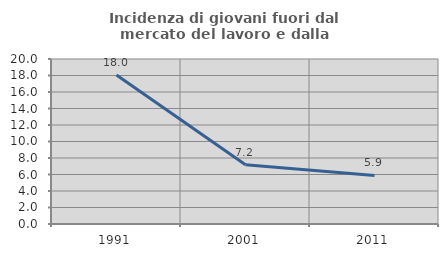
| Category | Incidenza di giovani fuori dal mercato del lavoro e dalla formazione  |
|---|---|
| 1991.0 | 18.049 |
| 2001.0 | 7.19 |
| 2011.0 | 5.882 |